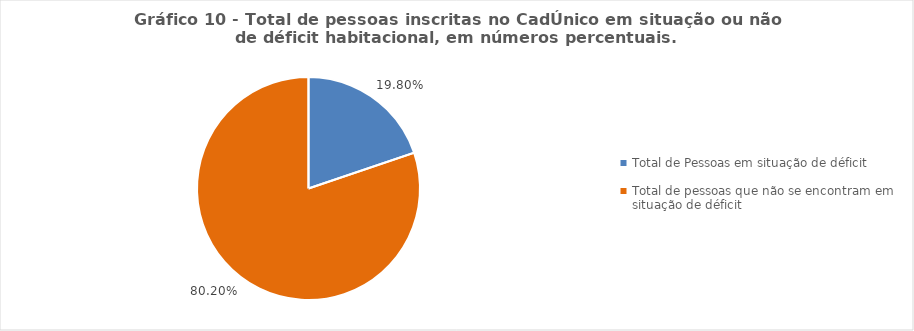
| Category | Series 0 |
|---|---|
| Total de Pessoas em situação de déficit | 0.198 |
| Total de pessoas que não se encontram em situação de déficit | 0.802 |